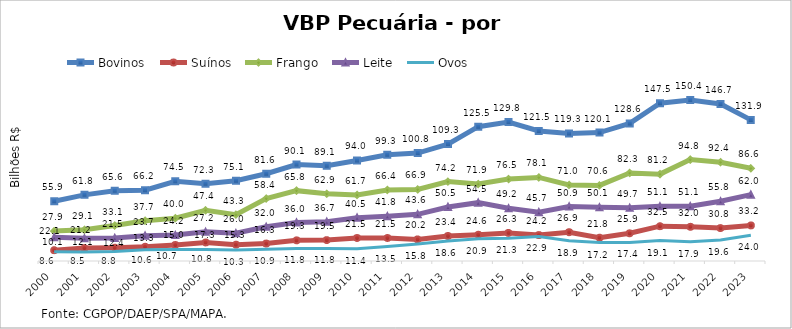
| Category | Bovinos | Suínos | Frango | Leite | Ovos |
|---|---|---|---|---|---|
| 2000 | 55.907 | 10.123 | 27.926 | 22.083 | 8.634 |
| 2001 | 61.8 | 12.144 | 29.144 | 21.25 | 8.508 |
| 2002 | 65.581 | 12.447 | 33.095 | 21.517 | 8.766 |
| 2003 | 66.188 | 13.303 | 37.676 | 23.695 | 10.603 |
| 2004 | 74.47 | 14.956 | 40.031 | 24.217 | 10.747 |
| 2005 | 72.299 | 17.341 | 47.38 | 27.238 | 10.82 |
| 2006 | 75.065 | 15.254 | 43.346 | 26.017 | 10.278 |
| 2007 | 81.578 | 16.311 | 58.361 | 31.983 | 10.923 |
| 2008 | 90.072 | 19.314 | 65.754 | 35.98 | 11.796 |
| 2009 | 89.132 | 19.523 | 62.854 | 36.682 | 11.762 |
| 2010 | 93.972 | 21.477 | 61.724 | 40.51 | 11.44 |
| 2011 | 99.343 | 21.511 | 66.393 | 41.761 | 13.48 |
| 2012 | 100.824 | 20.198 | 66.86 | 43.638 | 15.802 |
| 2013 | 109.257 | 23.386 | 74.177 | 50.498 | 18.585 |
| 2014 | 125.517 | 24.563 | 71.899 | 54.531 | 20.881 |
| 2015 | 129.837 | 26.25 | 76.534 | 49.224 | 21.261 |
| 2016 | 121.533 | 24.225 | 78.112 | 45.674 | 22.921 |
| 2017 | 119.264 | 26.892 | 71.047 | 50.89 | 18.893 |
| 2018 | 120.063 | 21.779 | 70.633 | 50.134 | 17.18 |
| 2019 | 128.561 | 25.887 | 82.313 | 49.669 | 17.399 |
| 2020 | 147.468 | 32.539 | 81.19 | 51.067 | 19.108 |
| 2021 | 150.378 | 31.96 | 94.756 | 51.123 | 17.906 |
| 2022 | 146.737 | 30.774 | 92.356 | 55.816 | 19.615 |
| 2023 | 131.864 | 33.249 | 86.639 | 62.009 | 23.991 |